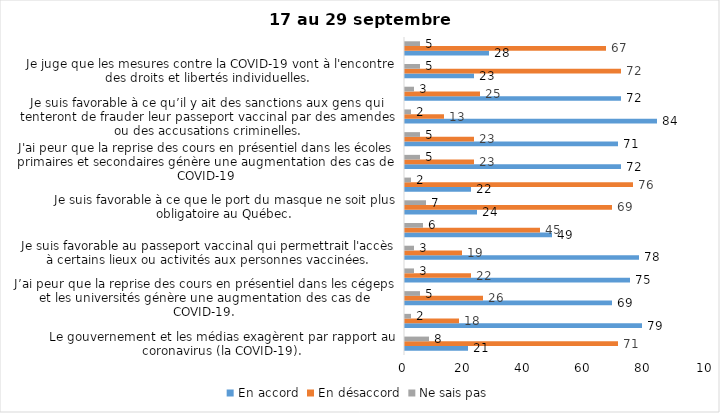
| Category | En accord | En désaccord | Ne sais pas |
|---|---|---|---|
| Le gouvernement et les médias exagèrent par rapport au coronavirus (la COVID-19). | 21 | 71 | 8 |
| J’ai peur que le système de santé soit débordé par les cas de COVID-19. | 79 | 18 | 2 |
| J’ai peur que la reprise des cours en présentiel dans les cégeps et les universités génère une augmentation des cas de COVID-19. | 69 | 26 | 5 |
| Je suis inquiet/inquiète  que le nombre de cas augmente en raison des nouveaux variants du virus de la COVID-19 | 75 | 22 | 3 |
| Je suis favorable au passeport vaccinal qui permettrait l'accès à certains lieux ou activités aux personnes vaccinées. | 78 | 19 | 3 |
| Si les cas de COVID-19 augmentent cet automne, je suis favorable à la mise en place de mesures de confinement (ex. fermeture de services non essentiels, interdiction des rassemblements privés) | 49 | 45 | 6 |
| Je suis favorable à ce que le port du masque ne soit plus obligatoire au Québec. | 24 | 69 | 7 |
| Étant donné la progression de la vaccination, je pense qu’il est moins important de suivre les mesures de prévention. | 22 | 76 | 2 |
| J'ai peur que la reprise des cours en présentiel dans les écoles primaires et secondaires génère une augmentation des cas de COVID-19 | 72 | 23 | 5 |
| Je suis favorable à ce qu’il y ait des sanctions aux commerçants qui ne vérifieront pas le passeport vaccinal (code QR) de leurs clients | 71 | 23 | 5 |
| Je suis favorable à ce qu’il y ait des sanctions aux gens qui tenteront de frauder leur passeport vaccinal par des amendes ou des accusations criminelles. | 84 | 13 | 2 |
| Je crois que le passeport vaccinal devrait être requis pour davantage de services et commerces (ex. : spas, centre d’achats, centre de soins personnels. | 72 | 25 | 3 |
| Je juge que les mesures contre la COVID-19 vont à l'encontre des droits et libertés individuelles.  | 23 | 72 | 5 |
| Je pense que le gouvernement du Québec devrait mettre fin à l’état d’urgence sanitaire.  | 28 | 67 | 5 |